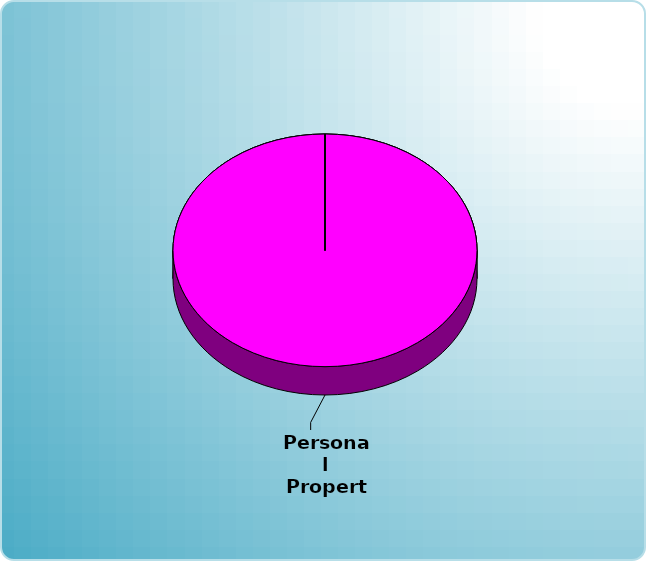
| Category | Series 0 |
|---|---|
| Cash | 0 |
| Bonds | 0 |
| Muni Bond | 0 |
| Hybrid bond | 0 |
| Value | 0 |
| Growth | 0 |
| Small-Cap | 0 |
| Tangibles | 0 |
| International | 0 |
| Personal Property | 75000 |
| Miscellaneous | 0 |